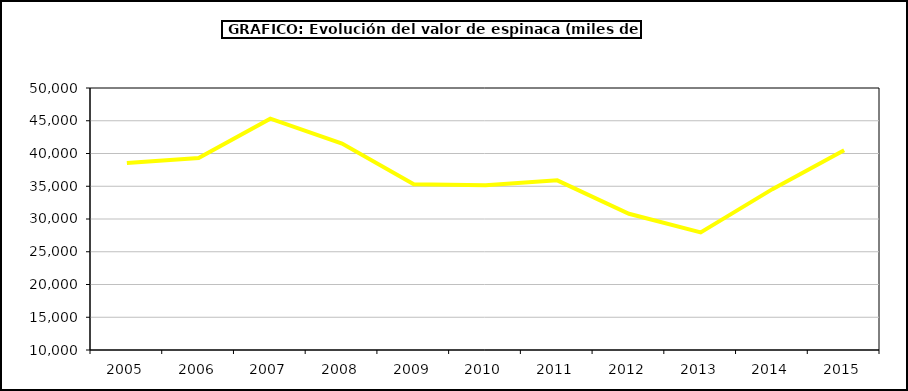
| Category | Valor |
|---|---|
| 2005.0 | 38533.952 |
| 2006.0 | 39323.641 |
| 2007.0 | 45310.858 |
| 2008.0 | 41526.143 |
| 2009.0 | 35291.496 |
| 2010.0 | 35154.695 |
| 2011.0 | 35899.468 |
| 2012.0 | 30801.916 |
| 2013.0 | 27951.792 |
| 2014.0 | 34558.726 |
| 2015.0 | 40502 |